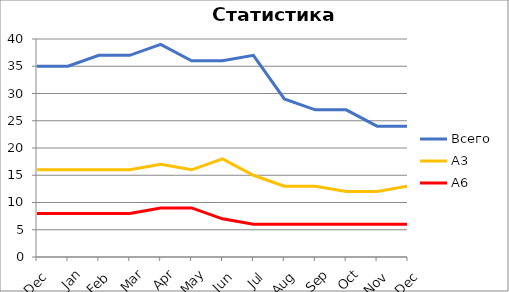
| Category | Всего | А3 | A6 |
|---|---|---|---|
| Dec | 35 | 16 | 8 |
| Jan | 35 | 16 | 8 |
| Feb | 37 | 16 | 8 |
| Mar | 37 | 16 | 8 |
| Apr | 39 | 17 | 9 |
| May | 36 | 16 | 9 |
| Jun | 36 | 18 | 7 |
| Jul | 37 | 15 | 6 |
| Aug | 29 | 13 | 6 |
| Sep | 27 | 13 | 6 |
| Oct | 27 | 12 | 6 |
| Nov | 24 | 12 | 6 |
| Dec | 24 | 13 | 6 |